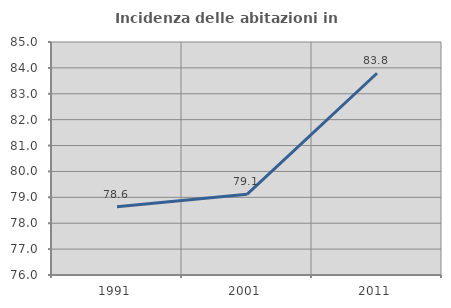
| Category | Incidenza delle abitazioni in proprietà  |
|---|---|
| 1991.0 | 78.636 |
| 2001.0 | 79.117 |
| 2011.0 | 83.793 |